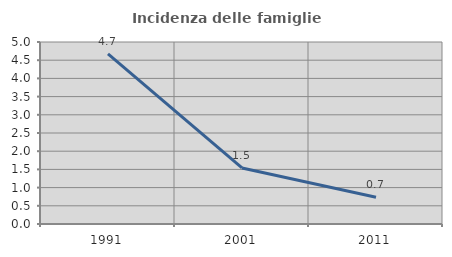
| Category | Incidenza delle famiglie numerose |
|---|---|
| 1991.0 | 4.674 |
| 2001.0 | 1.54 |
| 2011.0 | 0.733 |